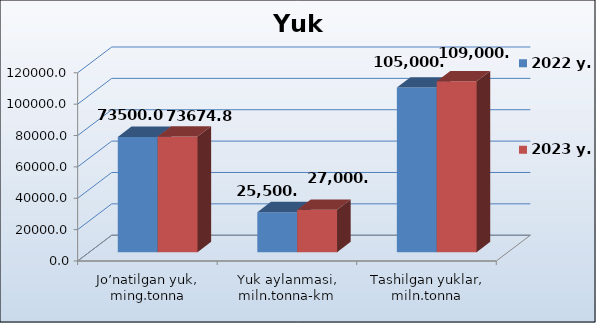
| Category | 2022 y. | 2023 y. |
|---|---|---|
| Jo’natilgan yuk, ming.tonna | 73500 | 73674.8 |
| Yuk aylanmasi, miln.tonna-km | 25500.5 | 27000 |
| Tashilgan yuklar, miln.tonna | 105000 | 109000.4 |